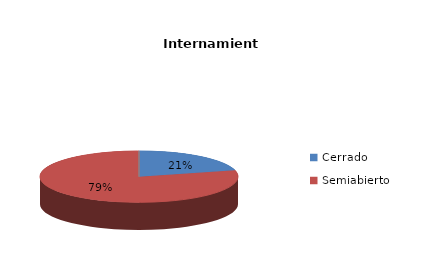
| Category | Series 0 |
|---|---|
| Cerrado | 4 |
| Semiabierto | 15 |
| Abierto | 0 |
| Terapeúticos | 0 |